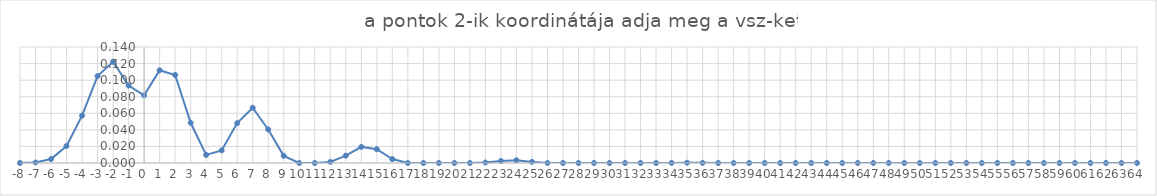
| Category | Series 0 |
|---|---|
| -8.0 | 0 |
| -7.0 | 0.001 |
| -6.0 | 0.005 |
| -5.0 | 0.021 |
| -4.0 | 0.057 |
| -3.0 | 0.105 |
| -2.0 | 0.122 |
| -1.0 | 0.093 |
| 0.0 | 0.082 |
| 1.0 | 0.112 |
| 2.0 | 0.106 |
| 3.0 | 0.049 |
| 4.0 | 0.01 |
| 5.0 | 0.015 |
| 6.0 | 0.048 |
| 7.0 | 0.067 |
| 8.0 | 0.04 |
| 9.0 | 0.009 |
| 10.0 | 0 |
| 11.0 | 0 |
| 12.0 | 0.001 |
| 13.0 | 0.009 |
| 14.0 | 0.019 |
| 15.0 | 0.017 |
| 16.0 | 0.005 |
| 17.0 | 0 |
| 18.0 | 0 |
| 19.0 | 0 |
| 20.0 | 0 |
| 21.0 | 0 |
| 22.0 | 0.001 |
| 23.0 | 0.002 |
| 24.0 | 0.003 |
| 25.0 | 0.001 |
| 26.0 | 0 |
| 27.0 | 0 |
| 28.0 | 0 |
| 29.0 | 0 |
| 30.0 | 0 |
| 31.0 | 0 |
| 32.0 | 0 |
| 33.0 | 0 |
| 34.0 | 0 |
| 35.0 | 0 |
| 36.0 | 0 |
| 37.0 | 0 |
| 38.0 | 0 |
| 39.0 | 0 |
| 40.0 | 0 |
| 41.0 | 0 |
| 42.0 | 0 |
| 43.0 | 0 |
| 44.0 | 0 |
| 45.0 | 0 |
| 46.0 | 0 |
| 47.0 | 0 |
| 48.0 | 0 |
| 49.0 | 0 |
| 50.0 | 0 |
| 51.0 | 0 |
| 52.0 | 0 |
| 53.0 | 0 |
| 54.0 | 0 |
| 55.0 | 0 |
| 56.0 | 0 |
| 57.0 | 0 |
| 58.0 | 0 |
| 59.0 | 0 |
| 60.0 | 0 |
| 61.0 | 0 |
| 62.0 | 0 |
| 63.0 | 0 |
| 64.0 | 0 |